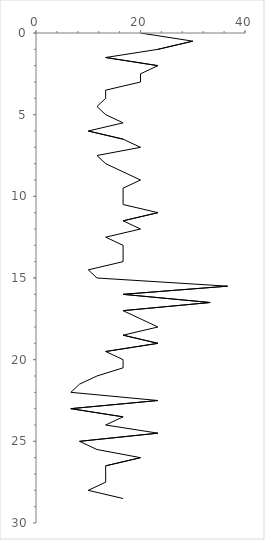
| Category | Series 0 |
|---|---|
| 20.000000000000004 | 0 |
| 30.000000000000004 | 0.5 |
| 23.333333333333332 | 1 |
| 13.333333333333334 | 1.5 |
| 23.333333333333332 | 2 |
| 20.000000000000004 | 2.5 |
| 20.000000000000004 | 3 |
| 13.333333333333334 | 3.5 |
| 13.333333333333334 | 4 |
| 11.666666666666668 | 4.5 |
| 13.333333333333334 | 5 |
| 16.666666666666664 | 5.5 |
| 10.000000000000002 | 6 |
| 16.666666666666664 | 6.5 |
| 20.000000000000004 | 7 |
| 11.666666666666668 | 7.5 |
| 13.333333333333334 | 8 |
| 16.666666666666664 | 8.5 |
| 20.000000000000004 | 9 |
| 16.666666666666664 | 9.5 |
| 16.666666666666664 | 10 |
| 16.666666666666664 | 10.5 |
| 23.333333333333332 | 11 |
| 16.666666666666664 | 11.5 |
| 20.000000000000004 | 12 |
| 13.333333333333334 | 12.5 |
| 16.666666666666664 | 13 |
| 16.666666666666664 | 13.5 |
| 16.666666666666664 | 14 |
| 10.000000000000002 | 14.5 |
| 11.666666666666668 | 15 |
| 36.66666666666667 | 15.5 |
| 16.666666666666664 | 16 |
| 33.33333333333333 | 16.5 |
| 16.666666666666664 | 17 |
| 20.000000000000004 | 17.5 |
| 23.333333333333332 | 18 |
| 16.666666666666664 | 18.5 |
| 23.333333333333332 | 19 |
| 13.333333333333334 | 19.5 |
| 16.666666666666664 | 20 |
| 16.666666666666664 | 20.5 |
| 11.666666666666666 | 21 |
| 8.333333333333332 | 21.5 |
| 6.666666666666667 | 22 |
| 23.333333333333332 | 22.5 |
| 6.666666666666667 | 23 |
| 16.666666666666664 | 23.5 |
| 13.333333333333334 | 24 |
| 23.333333333333332 | 24.5 |
| 8.333333333333332 | 25 |
| 11.666666666666668 | 25.5 |
| 20.000000000000004 | 26 |
| 13.333333333333334 | 26.5 |
| 13.333333333333334 | 27 |
| 13.333333333333334 | 27.5 |
| 10.000000000000002 | 28 |
| 16.666666666666664 | 28.5 |